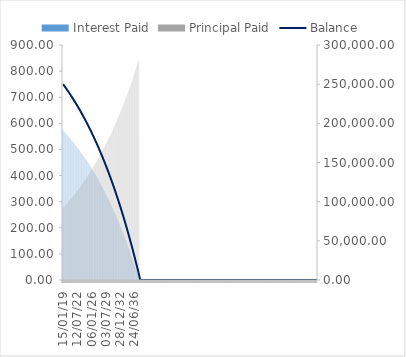
| Category | Interest Paid | Principal Paid |
|---|---|---|
| 15/01/19 | 576.148 | 273.29 |
| 29/01/19 | 575.519 | 273.92 |
| 12/02/19 | 574.887 | 274.551 |
| 26/02/19 | 574.255 | 275.184 |
| 12/03/19 | 573.62 | 275.818 |
| 26/03/19 | 572.985 | 276.453 |
| 09/04/19 | 572.348 | 277.09 |
| 23/04/19 | 571.709 | 277.729 |
| 07/05/19 | 571.069 | 278.369 |
| 21/05/19 | 570.428 | 279.011 |
| 04/06/19 | 569.784 | 279.654 |
| 18/06/19 | 569.14 | 280.298 |
| 02/07/19 | 568.494 | 280.944 |
| 16/07/19 | 567.847 | 281.592 |
| 30/07/19 | 567.198 | 282.241 |
| 13/08/19 | 566.547 | 282.891 |
| 27/08/19 | 565.895 | 283.543 |
| 10/09/19 | 565.242 | 284.196 |
| 24/09/19 | 564.587 | 284.851 |
| 08/10/19 | 563.93 | 285.508 |
| 22/10/19 | 563.272 | 286.166 |
| 05/11/19 | 562.613 | 286.825 |
| 19/11/19 | 561.952 | 287.486 |
| 03/12/19 | 561.289 | 288.149 |
| 17/12/19 | 560.625 | 288.813 |
| 31/12/19 | 559.96 | 289.479 |
| 14/01/20 | 559.293 | 290.146 |
| 28/01/20 | 558.624 | 290.814 |
| 11/02/20 | 557.954 | 291.485 |
| 25/02/20 | 557.282 | 292.156 |
| 10/03/20 | 556.609 | 292.83 |
| 24/03/20 | 555.934 | 293.504 |
| 07/04/20 | 555.257 | 294.181 |
| 21/04/20 | 554.579 | 294.859 |
| 05/05/20 | 553.9 | 295.538 |
| 19/05/20 | 553.219 | 296.219 |
| 02/06/20 | 552.536 | 296.902 |
| 16/06/20 | 551.852 | 297.586 |
| 30/06/20 | 551.166 | 298.272 |
| 14/07/20 | 550.479 | 298.96 |
| 28/07/20 | 549.79 | 299.649 |
| 11/08/20 | 549.099 | 300.339 |
| 25/08/20 | 548.407 | 301.031 |
| 08/09/20 | 547.713 | 301.725 |
| 22/09/20 | 547.018 | 302.42 |
| 06/10/20 | 546.321 | 303.117 |
| 20/10/20 | 545.622 | 303.816 |
| 03/11/20 | 544.922 | 304.516 |
| 17/11/20 | 544.22 | 305.218 |
| 01/12/20 | 543.517 | 305.921 |
| 15/12/20 | 542.812 | 306.626 |
| 29/12/20 | 542.105 | 307.333 |
| 12/01/21 | 541.397 | 308.041 |
| 26/01/21 | 540.687 | 308.751 |
| 09/02/21 | 539.976 | 309.463 |
| 23/02/21 | 539.262 | 310.176 |
| 09/03/21 | 538.548 | 310.891 |
| 23/03/21 | 537.831 | 311.607 |
| 06/04/21 | 537.113 | 312.325 |
| 20/04/21 | 536.393 | 313.045 |
| 04/05/21 | 535.672 | 313.766 |
| 18/05/21 | 534.949 | 314.49 |
| 01/06/21 | 534.224 | 315.214 |
| 15/06/21 | 533.497 | 315.941 |
| 29/06/21 | 532.769 | 316.669 |
| 13/07/21 | 532.039 | 317.399 |
| 27/07/21 | 531.308 | 318.13 |
| 10/08/21 | 530.575 | 318.863 |
| 24/08/21 | 529.84 | 319.598 |
| 07/09/21 | 529.103 | 320.335 |
| 21/09/21 | 528.365 | 321.073 |
| 05/10/21 | 527.625 | 321.813 |
| 19/10/21 | 526.884 | 322.555 |
| 02/11/21 | 526.14 | 323.298 |
| 16/11/21 | 525.395 | 324.043 |
| 30/11/21 | 524.648 | 324.79 |
| 14/12/21 | 523.9 | 325.538 |
| 28/12/21 | 523.15 | 326.289 |
| 11/01/22 | 522.398 | 327.04 |
| 25/01/22 | 521.644 | 327.794 |
| 08/02/22 | 520.889 | 328.55 |
| 22/02/22 | 520.131 | 329.307 |
| 08/03/22 | 519.372 | 330.066 |
| 22/03/22 | 518.612 | 330.826 |
| 05/04/22 | 517.849 | 331.589 |
| 19/04/22 | 517.085 | 332.353 |
| 03/05/22 | 516.319 | 333.119 |
| 17/05/22 | 515.552 | 333.887 |
| 31/05/22 | 514.782 | 334.656 |
| 14/06/22 | 514.011 | 335.427 |
| 28/06/22 | 513.238 | 336.2 |
| 12/07/22 | 512.463 | 336.975 |
| 26/07/22 | 511.686 | 337.752 |
| 09/08/22 | 510.908 | 338.53 |
| 23/08/22 | 510.128 | 339.31 |
| 06/09/22 | 509.346 | 340.092 |
| 20/09/22 | 508.562 | 340.876 |
| 04/10/22 | 507.777 | 341.662 |
| 18/10/22 | 506.989 | 342.449 |
| 01/11/22 | 506.2 | 343.238 |
| 15/11/22 | 505.409 | 344.029 |
| 29/11/22 | 504.616 | 344.822 |
| 13/12/22 | 503.821 | 345.617 |
| 27/12/22 | 503.025 | 346.413 |
| 10/01/23 | 502.227 | 347.212 |
| 24/01/23 | 501.426 | 348.012 |
| 07/02/23 | 500.624 | 348.814 |
| 21/02/23 | 499.82 | 349.618 |
| 07/03/23 | 499.015 | 350.423 |
| 21/03/23 | 498.207 | 351.231 |
| 04/04/23 | 497.398 | 352.04 |
| 18/04/23 | 496.586 | 352.852 |
| 02/05/23 | 495.773 | 353.665 |
| 16/05/23 | 494.958 | 354.48 |
| 30/05/23 | 494.141 | 355.297 |
| 13/06/23 | 493.322 | 356.116 |
| 27/06/23 | 492.502 | 356.936 |
| 11/07/23 | 491.679 | 357.759 |
| 25/07/23 | 490.855 | 358.584 |
| 08/08/23 | 490.028 | 359.41 |
| 22/08/23 | 489.2 | 360.238 |
| 05/09/23 | 488.37 | 361.068 |
| 19/09/23 | 487.538 | 361.901 |
| 03/10/23 | 486.704 | 362.735 |
| 17/10/23 | 485.868 | 363.571 |
| 31/10/23 | 485.03 | 364.408 |
| 14/11/23 | 484.19 | 365.248 |
| 28/11/23 | 483.348 | 366.09 |
| 12/12/23 | 482.504 | 366.934 |
| 26/12/23 | 481.659 | 367.779 |
| 09/01/24 | 480.811 | 368.627 |
| 23/01/24 | 479.962 | 369.476 |
| 06/02/24 | 479.11 | 370.328 |
| 20/02/24 | 478.257 | 371.181 |
| 05/03/24 | 477.401 | 372.037 |
| 19/03/24 | 476.544 | 372.894 |
| 02/04/24 | 475.685 | 373.754 |
| 16/04/24 | 474.823 | 374.615 |
| 30/04/24 | 473.96 | 375.478 |
| 14/05/24 | 473.095 | 376.344 |
| 28/05/24 | 472.227 | 377.211 |
| 11/06/24 | 471.358 | 378.08 |
| 25/06/24 | 470.487 | 378.952 |
| 09/07/24 | 469.613 | 379.825 |
| 23/07/24 | 468.738 | 380.7 |
| 06/08/24 | 467.861 | 381.578 |
| 20/08/24 | 466.981 | 382.457 |
| 03/09/24 | 466.1 | 383.338 |
| 17/09/24 | 465.216 | 384.222 |
| 01/10/24 | 464.331 | 385.107 |
| 15/10/24 | 463.443 | 385.995 |
| 29/10/24 | 462.554 | 386.884 |
| 12/11/24 | 461.662 | 387.776 |
| 26/11/24 | 460.769 | 388.67 |
| 10/12/24 | 459.873 | 389.565 |
| 24/12/24 | 458.975 | 390.463 |
| 07/01/25 | 458.075 | 391.363 |
| 21/01/25 | 457.173 | 392.265 |
| 04/02/25 | 456.269 | 393.169 |
| 18/02/25 | 455.363 | 394.075 |
| 04/03/25 | 454.455 | 394.983 |
| 18/03/25 | 453.545 | 395.893 |
| 01/04/25 | 452.632 | 396.806 |
| 15/04/25 | 451.718 | 397.72 |
| 29/04/25 | 450.801 | 398.637 |
| 13/05/25 | 449.883 | 399.556 |
| 27/05/25 | 448.962 | 400.476 |
| 10/06/25 | 448.039 | 401.399 |
| 24/06/25 | 447.114 | 402.324 |
| 08/07/25 | 446.187 | 403.252 |
| 22/07/25 | 445.257 | 404.181 |
| 05/08/25 | 444.326 | 405.112 |
| 19/08/25 | 443.392 | 406.046 |
| 02/09/25 | 442.456 | 406.982 |
| 16/09/25 | 441.518 | 407.92 |
| 30/09/25 | 440.578 | 408.86 |
| 14/10/25 | 439.636 | 409.802 |
| 28/10/25 | 438.692 | 410.747 |
| 11/11/25 | 437.745 | 411.693 |
| 25/11/25 | 436.796 | 412.642 |
| 09/12/25 | 435.845 | 413.593 |
| 23/12/25 | 434.892 | 414.546 |
| 06/01/26 | 433.937 | 415.501 |
| 20/01/26 | 432.979 | 416.459 |
| 03/02/26 | 432.019 | 417.419 |
| 17/02/26 | 431.057 | 418.381 |
| 03/03/26 | 430.093 | 419.345 |
| 17/03/26 | 429.127 | 420.311 |
| 31/03/26 | 428.158 | 421.28 |
| 14/04/26 | 427.187 | 422.251 |
| 28/04/26 | 426.214 | 423.224 |
| 12/05/26 | 425.239 | 424.199 |
| 26/05/26 | 424.261 | 425.177 |
| 09/06/26 | 423.281 | 426.157 |
| 23/06/26 | 422.299 | 427.139 |
| 07/07/26 | 421.315 | 428.123 |
| 21/07/26 | 420.328 | 429.11 |
| 04/08/26 | 419.339 | 430.099 |
| 18/08/26 | 418.348 | 431.09 |
| 01/09/26 | 417.355 | 432.084 |
| 15/09/26 | 416.359 | 433.079 |
| 29/09/26 | 415.361 | 434.077 |
| 13/10/26 | 414.36 | 435.078 |
| 27/10/26 | 413.358 | 436.08 |
| 10/11/26 | 412.353 | 437.085 |
| 24/11/26 | 411.345 | 438.093 |
| 08/12/26 | 410.336 | 439.102 |
| 22/12/26 | 409.324 | 440.114 |
| 05/01/27 | 408.31 | 441.129 |
| 19/01/27 | 407.293 | 442.145 |
| 02/02/27 | 406.274 | 443.164 |
| 16/02/27 | 405.253 | 444.186 |
| 02/03/27 | 404.229 | 445.209 |
| 16/03/27 | 403.203 | 446.235 |
| 30/03/27 | 402.175 | 447.264 |
| 13/04/27 | 401.144 | 448.294 |
| 27/04/27 | 400.111 | 449.327 |
| 11/05/27 | 399.075 | 450.363 |
| 25/05/27 | 398.037 | 451.401 |
| 08/06/27 | 396.997 | 452.441 |
| 22/06/27 | 395.954 | 453.484 |
| 06/07/27 | 394.909 | 454.529 |
| 20/07/27 | 393.862 | 455.577 |
| 03/08/27 | 392.812 | 456.626 |
| 17/08/27 | 391.759 | 457.679 |
| 31/08/27 | 390.705 | 458.734 |
| 14/09/27 | 389.647 | 459.791 |
| 28/09/27 | 388.588 | 460.85 |
| 12/10/27 | 387.526 | 461.912 |
| 26/10/27 | 386.461 | 462.977 |
| 09/11/27 | 385.394 | 464.044 |
| 23/11/27 | 384.325 | 465.113 |
| 07/12/27 | 383.253 | 466.185 |
| 21/12/27 | 382.179 | 467.26 |
| 04/01/28 | 381.102 | 468.336 |
| 18/01/28 | 380.022 | 469.416 |
| 01/02/28 | 378.941 | 470.498 |
| 15/02/28 | 377.856 | 471.582 |
| 29/02/28 | 376.769 | 472.669 |
| 14/03/28 | 375.68 | 473.758 |
| 28/03/28 | 374.588 | 474.85 |
| 11/04/28 | 373.494 | 475.944 |
| 25/04/28 | 372.397 | 477.041 |
| 09/05/28 | 371.298 | 478.14 |
| 23/05/28 | 370.196 | 479.242 |
| 06/06/28 | 369.091 | 480.347 |
| 20/06/28 | 367.984 | 481.454 |
| 04/07/28 | 366.875 | 482.563 |
| 18/07/28 | 365.763 | 483.675 |
| 01/08/28 | 364.648 | 484.79 |
| 15/08/28 | 363.531 | 485.907 |
| 29/08/28 | 362.411 | 487.027 |
| 12/09/28 | 361.289 | 488.15 |
| 26/09/28 | 360.164 | 489.275 |
| 10/10/28 | 359.036 | 490.402 |
| 24/10/28 | 357.906 | 491.532 |
| 07/11/28 | 356.773 | 492.665 |
| 21/11/28 | 355.638 | 493.801 |
| 05/12/28 | 354.5 | 494.939 |
| 19/12/28 | 353.359 | 496.079 |
| 02/01/29 | 352.216 | 497.222 |
| 16/01/29 | 351.07 | 498.368 |
| 30/01/29 | 349.921 | 499.517 |
| 13/02/29 | 348.77 | 500.668 |
| 27/02/29 | 347.616 | 501.822 |
| 13/03/29 | 346.46 | 502.978 |
| 27/03/29 | 345.301 | 504.138 |
| 10/04/29 | 344.139 | 505.299 |
| 24/04/29 | 342.974 | 506.464 |
| 08/05/29 | 341.807 | 507.631 |
| 22/05/29 | 340.637 | 508.801 |
| 05/06/29 | 339.465 | 509.974 |
| 19/06/29 | 338.289 | 511.149 |
| 03/07/29 | 337.111 | 512.327 |
| 17/07/29 | 335.931 | 513.508 |
| 31/07/29 | 334.747 | 514.691 |
| 14/08/29 | 333.561 | 515.877 |
| 28/08/29 | 332.372 | 517.066 |
| 11/09/29 | 331.181 | 518.258 |
| 25/09/29 | 329.986 | 519.452 |
| 09/10/29 | 328.789 | 520.649 |
| 23/10/29 | 327.589 | 521.849 |
| 06/11/29 | 326.387 | 523.052 |
| 20/11/29 | 325.181 | 524.257 |
| 04/12/29 | 323.973 | 525.465 |
| 18/12/29 | 322.762 | 526.676 |
| 01/01/30 | 321.548 | 527.89 |
| 15/01/30 | 320.332 | 529.107 |
| 29/01/30 | 319.112 | 530.326 |
| 12/02/30 | 317.89 | 531.548 |
| 26/02/30 | 316.665 | 532.773 |
| 12/03/30 | 315.437 | 534.001 |
| 26/03/30 | 314.207 | 535.232 |
| 09/04/30 | 312.973 | 536.465 |
| 23/04/30 | 311.737 | 537.701 |
| 07/05/30 | 310.498 | 538.941 |
| 21/05/30 | 309.255 | 540.183 |
| 04/06/30 | 308.011 | 541.428 |
| 18/06/30 | 306.763 | 542.675 |
| 02/07/30 | 305.512 | 543.926 |
| 16/07/30 | 304.259 | 545.18 |
| 30/07/30 | 303.002 | 546.436 |
| 13/08/30 | 301.743 | 547.695 |
| 27/08/30 | 300.481 | 548.957 |
| 10/09/30 | 299.216 | 550.223 |
| 24/09/30 | 297.948 | 551.491 |
| 08/10/30 | 296.677 | 552.762 |
| 22/10/30 | 295.403 | 554.035 |
| 05/11/30 | 294.126 | 555.312 |
| 19/11/30 | 292.846 | 556.592 |
| 03/12/30 | 291.563 | 557.875 |
| 17/12/30 | 290.278 | 559.16 |
| 31/12/30 | 288.989 | 560.449 |
| 14/01/31 | 287.697 | 561.741 |
| 28/01/31 | 286.403 | 563.035 |
| 11/02/31 | 285.105 | 564.333 |
| 25/02/31 | 283.805 | 565.633 |
| 11/03/31 | 282.501 | 566.937 |
| 25/03/31 | 281.195 | 568.244 |
| 08/04/31 | 279.885 | 569.553 |
| 22/04/31 | 278.572 | 570.866 |
| 06/05/31 | 277.257 | 572.181 |
| 20/05/31 | 275.938 | 573.5 |
| 03/06/31 | 274.617 | 574.822 |
| 17/06/31 | 273.292 | 576.146 |
| 01/07/31 | 271.964 | 577.474 |
| 15/07/31 | 270.633 | 578.805 |
| 29/07/31 | 269.299 | 580.139 |
| 12/08/31 | 267.962 | 581.476 |
| 26/08/31 | 266.622 | 582.816 |
| 09/09/31 | 265.279 | 584.159 |
| 23/09/31 | 263.933 | 585.505 |
| 07/10/31 | 262.583 | 586.855 |
| 21/10/31 | 261.231 | 588.207 |
| 04/11/31 | 259.875 | 589.563 |
| 18/11/31 | 258.517 | 590.921 |
| 02/12/31 | 257.155 | 592.283 |
| 16/12/31 | 255.79 | 593.648 |
| 30/12/31 | 254.422 | 595.016 |
| 13/01/32 | 253.05 | 596.388 |
| 27/01/32 | 251.676 | 597.762 |
| 10/02/32 | 250.298 | 599.14 |
| 24/02/32 | 248.918 | 600.52 |
| 09/03/32 | 247.534 | 601.904 |
| 23/03/32 | 246.147 | 603.292 |
| 06/04/32 | 244.756 | 604.682 |
| 20/04/32 | 243.363 | 606.075 |
| 04/05/32 | 241.966 | 607.472 |
| 18/05/32 | 240.566 | 608.872 |
| 01/06/32 | 239.163 | 610.275 |
| 15/06/32 | 237.756 | 611.682 |
| 29/06/32 | 236.347 | 613.092 |
| 13/07/32 | 234.934 | 614.504 |
| 27/07/32 | 233.518 | 615.921 |
| 10/08/32 | 232.098 | 617.34 |
| 24/08/32 | 230.675 | 618.763 |
| 07/09/32 | 229.249 | 620.189 |
| 21/09/32 | 227.82 | 621.618 |
| 05/10/32 | 226.388 | 623.051 |
| 19/10/32 | 224.952 | 624.487 |
| 02/11/32 | 223.512 | 625.926 |
| 16/11/32 | 222.07 | 627.368 |
| 30/11/32 | 220.624 | 628.814 |
| 14/12/32 | 219.175 | 630.263 |
| 28/12/32 | 217.722 | 631.716 |
| 11/01/33 | 216.267 | 633.172 |
| 25/01/33 | 214.807 | 634.631 |
| 08/02/33 | 213.345 | 636.093 |
| 22/02/33 | 211.879 | 637.559 |
| 08/03/33 | 210.41 | 639.029 |
| 22/03/33 | 208.937 | 640.501 |
| 05/04/33 | 207.461 | 641.977 |
| 19/04/33 | 205.981 | 643.457 |
| 03/05/33 | 204.498 | 644.94 |
| 17/05/33 | 203.012 | 646.426 |
| 31/05/33 | 201.522 | 647.916 |
| 14/06/33 | 200.029 | 649.409 |
| 28/06/33 | 198.533 | 650.906 |
| 12/07/33 | 197.032 | 652.406 |
| 26/07/33 | 195.529 | 653.909 |
| 09/08/33 | 194.022 | 655.416 |
| 23/08/33 | 192.511 | 656.927 |
| 06/09/33 | 190.997 | 658.441 |
| 20/09/33 | 189.48 | 659.958 |
| 04/10/33 | 187.959 | 661.479 |
| 18/10/33 | 186.435 | 663.003 |
| 01/11/33 | 184.907 | 664.531 |
| 15/11/33 | 183.375 | 666.063 |
| 29/11/33 | 181.84 | 667.598 |
| 13/12/33 | 180.302 | 669.136 |
| 27/12/33 | 178.76 | 670.679 |
| 10/01/34 | 177.214 | 672.224 |
| 24/01/34 | 175.665 | 673.773 |
| 07/02/34 | 174.112 | 675.326 |
| 21/02/34 | 172.556 | 676.883 |
| 07/03/34 | 170.996 | 678.442 |
| 21/03/34 | 169.432 | 680.006 |
| 04/04/34 | 167.865 | 681.573 |
| 18/04/34 | 166.294 | 683.144 |
| 02/05/34 | 164.72 | 684.718 |
| 16/05/34 | 163.142 | 686.296 |
| 30/05/34 | 161.56 | 687.878 |
| 13/06/34 | 159.975 | 689.463 |
| 27/06/34 | 158.386 | 691.052 |
| 11/07/34 | 156.793 | 692.645 |
| 25/07/34 | 155.197 | 694.241 |
| 08/08/34 | 153.597 | 695.841 |
| 22/08/34 | 151.994 | 697.445 |
| 05/09/34 | 150.386 | 699.052 |
| 19/09/34 | 148.775 | 700.663 |
| 03/10/34 | 147.161 | 702.278 |
| 17/10/34 | 145.542 | 703.896 |
| 31/10/34 | 143.92 | 705.518 |
| 14/11/34 | 142.294 | 707.144 |
| 28/11/34 | 140.664 | 708.774 |
| 12/12/34 | 139.031 | 710.407 |
| 26/12/34 | 137.394 | 712.045 |
| 09/01/35 | 135.753 | 713.686 |
| 23/01/35 | 134.108 | 715.33 |
| 06/02/35 | 132.459 | 716.979 |
| 20/02/35 | 130.807 | 718.631 |
| 06/03/35 | 129.151 | 720.287 |
| 20/03/35 | 127.491 | 721.947 |
| 03/04/35 | 125.827 | 723.611 |
| 17/04/35 | 124.159 | 725.279 |
| 01/05/35 | 122.488 | 726.95 |
| 15/05/35 | 120.813 | 728.625 |
| 29/05/35 | 119.133 | 730.305 |
| 12/06/35 | 117.45 | 731.988 |
| 26/06/35 | 115.763 | 733.675 |
| 10/07/35 | 114.073 | 735.365 |
| 24/07/35 | 112.378 | 737.06 |
| 07/08/35 | 110.679 | 738.759 |
| 21/08/35 | 108.977 | 740.461 |
| 04/09/35 | 107.27 | 742.168 |
| 18/09/35 | 105.56 | 743.878 |
| 02/10/35 | 103.846 | 745.593 |
| 16/10/35 | 102.127 | 747.311 |
| 30/10/35 | 100.405 | 749.033 |
| 13/11/35 | 98.679 | 750.759 |
| 27/11/35 | 96.949 | 752.49 |
| 11/12/35 | 95.214 | 754.224 |
| 25/12/35 | 93.476 | 755.962 |
| 08/01/36 | 91.734 | 757.704 |
| 22/01/36 | 89.988 | 759.45 |
| 05/02/36 | 88.238 | 761.2 |
| 19/02/36 | 86.483 | 762.955 |
| 04/03/36 | 84.725 | 764.713 |
| 18/03/36 | 82.963 | 766.475 |
| 01/04/36 | 81.196 | 768.242 |
| 15/04/36 | 79.426 | 770.012 |
| 29/04/36 | 77.651 | 771.787 |
| 13/05/36 | 75.873 | 773.566 |
| 27/05/36 | 74.09 | 775.348 |
| 10/06/36 | 72.303 | 777.135 |
| 24/06/36 | 70.512 | 778.926 |
| 08/07/36 | 68.717 | 780.721 |
| 22/07/36 | 66.918 | 782.52 |
| 05/08/36 | 65.114 | 784.324 |
| 19/08/36 | 63.307 | 786.131 |
| 02/09/36 | 61.495 | 787.943 |
| 16/09/36 | 59.679 | 789.759 |
| 30/09/36 | 57.859 | 791.579 |
| 14/10/36 | 56.035 | 793.403 |
| 28/10/36 | 54.206 | 795.232 |
| 11/11/36 | 52.374 | 797.065 |
| 25/11/36 | 50.537 | 798.901 |
| 09/12/36 | 48.696 | 800.743 |
| 23/12/36 | 46.85 | 802.588 |
| 06/01/37 | 45.001 | 804.438 |
| 20/01/37 | 43.147 | 806.291 |
| 03/02/37 | 41.288 | 808.15 |
| 17/02/37 | 39.426 | 810.012 |
| 03/03/37 | 37.559 | 811.879 |
| 17/03/37 | 35.688 | 813.75 |
| 31/03/37 | 33.813 | 815.625 |
| 14/04/37 | 31.933 | 817.505 |
| 28/04/37 | 30.049 | 819.389 |
| 12/05/37 | 28.161 | 821.277 |
| 26/05/37 | 26.268 | 823.17 |
| 09/06/37 | 24.371 | 825.067 |
| 23/06/37 | 22.47 | 826.969 |
| 07/07/37 | 20.564 | 828.874 |
| 21/07/37 | 18.654 | 830.785 |
| 04/08/37 | 16.739 | 832.699 |
| 18/08/37 | 14.82 | 834.618 |
| 01/09/37 | 12.896 | 836.542 |
| 15/09/37 | 10.969 | 838.47 |
| 29/09/37 | 9.036 | 840.402 |
| 13/10/37 | 7.099 | 842.339 |
| 27/10/37 | 5.158 | 844.28 |
| 10/11/37 | 3.212 | 846.226 |
| 24/11/37 | 1.262 | 547.706 |